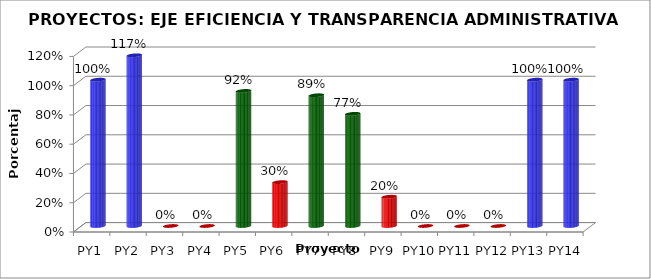
| Category | Series 0 |
|---|---|
| PY1 | 1 |
| PY2 | 1.167 |
| PY3 | 0 |
| PY4 | 0 |
| PY5 | 0.923 |
| PY6 | 0.3 |
| PY7 | 0.894 |
| PY8 | 0.767 |
| PY9 | 0.2 |
| PY10 | 0 |
| PY11 | 0 |
| PY12 | 0 |
| PY13 | 1 |
| PY14 | 1 |